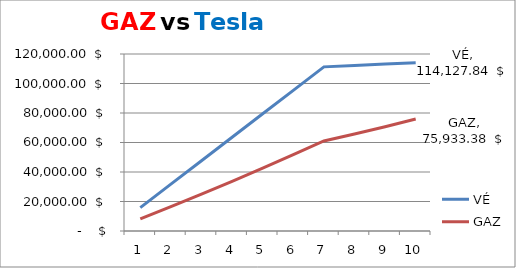
| Category | VÉ | GAZ |
|---|---|---|
| 0 | 15877.56 | 8169.44 |
| 1 | 31761.12 | 16506.93 |
| 2 | 47650.8 | 25020.872 |
| 3 | 63546.722 | 33720.09 |
| 4 | 79449.012 | 42613.847 |
| 5 | 95357.796 | 51711.869 |
| 6 | 111273.205 | 61024.37 |
| 7 | 112217.811 | 65753.635 |
| 8 | 113169.309 | 70719.363 |
| 9 | 114127.836 | 75933.377 |